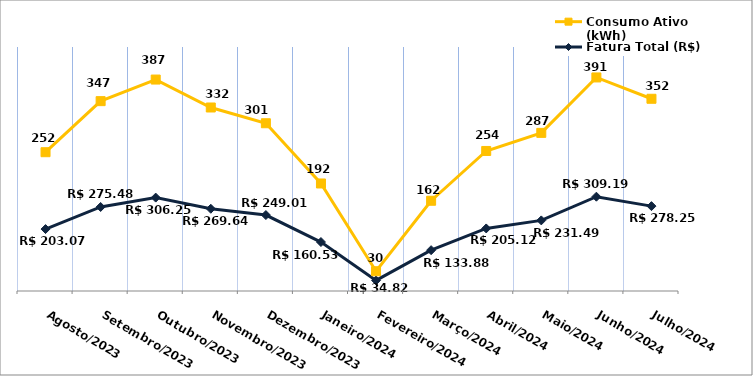
| Category | Fatura Total (R$) | Consumo Ativo (kWh) |
|---|---|---|
| Agosto/2023 | 203.07 | 252 |
| Setembro/2023 | 275.48 | 347 |
| Outubro/2023 | 306.25 | 387 |
| Novembro/2023 | 269.64 | 332 |
| Dezembro/2023 | 249.01 | 301 |
| Janeiro/2024 | 160.53 | 192 |
| Fevereiro/2024 | 34.82 | 30 |
| Março/2024 | 133.88 | 162 |
| Abril/2024 | 205.12 | 254 |
| Maio/2024 | 231.49 | 287 |
| Junho/2024 | 309.19 | 391 |
| Julho/2024 | 278.25 | 352 |